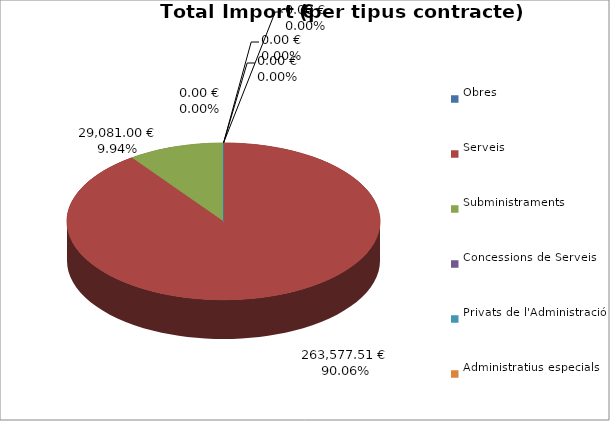
| Category | Total preu
(amb IVA) |
|---|---|
| Obres | 0 |
| Serveis | 263577.51 |
| Subministraments | 29081 |
| Concessions de Serveis | 0 |
| Privats de l'Administració | 0 |
| Administratius especials | 0 |